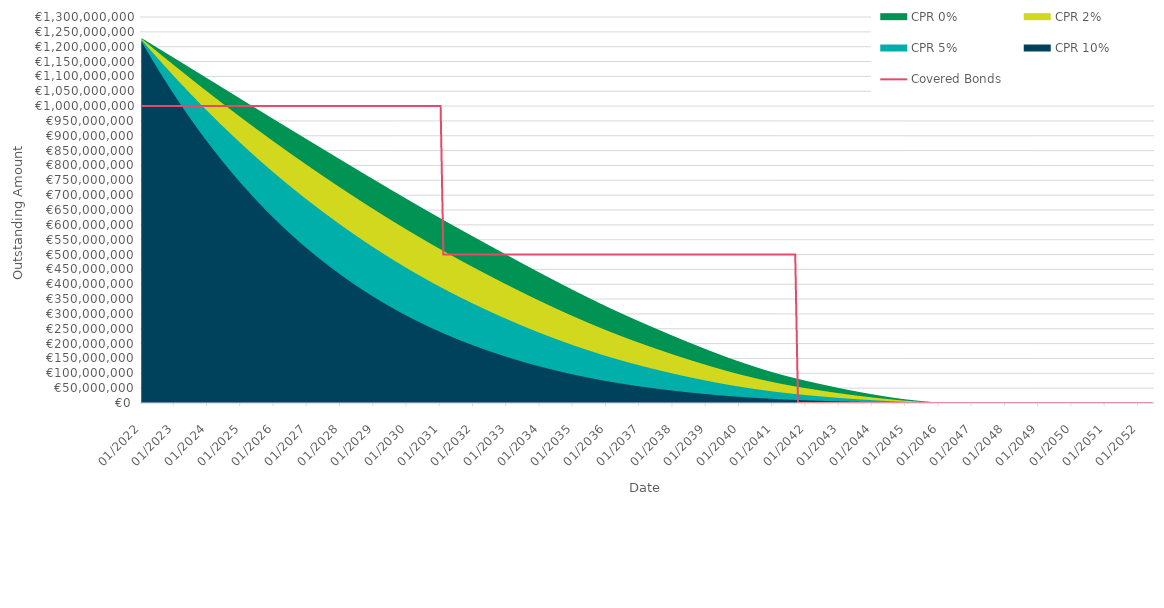
| Category | Covered Bonds |
|---|---|
| 2022-01-31 | 1000000000 |
| 2022-02-28 | 1000000000 |
| 2022-03-31 | 1000000000 |
| 2022-04-30 | 1000000000 |
| 2022-05-31 | 1000000000 |
| 2022-06-30 | 1000000000 |
| 2022-07-31 | 1000000000 |
| 2022-08-31 | 1000000000 |
| 2022-09-30 | 1000000000 |
| 2022-10-31 | 1000000000 |
| 2022-11-30 | 1000000000 |
| 2022-12-31 | 1000000000 |
| 2023-01-31 | 1000000000 |
| 2023-02-28 | 1000000000 |
| 2023-03-31 | 1000000000 |
| 2023-04-30 | 1000000000 |
| 2023-05-31 | 1000000000 |
| 2023-06-30 | 1000000000 |
| 2023-07-31 | 1000000000 |
| 2023-08-31 | 1000000000 |
| 2023-09-30 | 1000000000 |
| 2023-10-31 | 1000000000 |
| 2023-11-30 | 1000000000 |
| 2023-12-31 | 1000000000 |
| 2024-01-31 | 1000000000 |
| 2024-02-29 | 1000000000 |
| 2024-03-31 | 1000000000 |
| 2024-04-30 | 1000000000 |
| 2024-05-31 | 1000000000 |
| 2024-06-30 | 1000000000 |
| 2024-07-31 | 1000000000 |
| 2024-08-31 | 1000000000 |
| 2024-09-30 | 1000000000 |
| 2024-10-31 | 1000000000 |
| 2024-11-30 | 1000000000 |
| 2024-12-31 | 1000000000 |
| 2025-01-31 | 1000000000 |
| 2025-02-28 | 1000000000 |
| 2025-03-31 | 1000000000 |
| 2025-04-30 | 1000000000 |
| 2025-05-31 | 1000000000 |
| 2025-06-30 | 1000000000 |
| 2025-07-31 | 1000000000 |
| 2025-08-31 | 1000000000 |
| 2025-09-30 | 1000000000 |
| 2025-10-31 | 1000000000 |
| 2025-11-30 | 1000000000 |
| 2025-12-31 | 1000000000 |
| 2026-01-31 | 1000000000 |
| 2026-02-28 | 1000000000 |
| 2026-03-31 | 1000000000 |
| 2026-04-30 | 1000000000 |
| 2026-05-31 | 1000000000 |
| 2026-06-30 | 1000000000 |
| 2026-07-31 | 1000000000 |
| 2026-08-31 | 1000000000 |
| 2026-09-30 | 1000000000 |
| 2026-10-31 | 1000000000 |
| 2026-11-30 | 1000000000 |
| 2026-12-31 | 1000000000 |
| 2027-01-31 | 1000000000 |
| 2027-02-28 | 1000000000 |
| 2027-03-31 | 1000000000 |
| 2027-04-30 | 1000000000 |
| 2027-05-31 | 1000000000 |
| 2027-06-30 | 1000000000 |
| 2027-07-31 | 1000000000 |
| 2027-08-31 | 1000000000 |
| 2027-09-30 | 1000000000 |
| 2027-10-31 | 1000000000 |
| 2027-11-30 | 1000000000 |
| 2027-12-31 | 1000000000 |
| 2028-01-31 | 1000000000 |
| 2028-02-29 | 1000000000 |
| 2028-03-31 | 1000000000 |
| 2028-04-30 | 1000000000 |
| 2028-05-31 | 1000000000 |
| 2028-06-30 | 1000000000 |
| 2028-07-31 | 1000000000 |
| 2028-08-31 | 1000000000 |
| 2028-09-30 | 1000000000 |
| 2028-10-31 | 1000000000 |
| 2028-11-30 | 1000000000 |
| 2028-12-31 | 1000000000 |
| 2029-01-31 | 1000000000 |
| 2029-02-28 | 1000000000 |
| 2029-03-31 | 1000000000 |
| 2029-04-30 | 1000000000 |
| 2029-05-31 | 1000000000 |
| 2029-06-30 | 1000000000 |
| 2029-07-31 | 1000000000 |
| 2029-08-31 | 1000000000 |
| 2029-09-30 | 1000000000 |
| 2029-10-31 | 1000000000 |
| 2029-11-30 | 1000000000 |
| 2029-12-31 | 1000000000 |
| 2030-01-31 | 1000000000 |
| 2030-02-28 | 1000000000 |
| 2030-03-31 | 1000000000 |
| 2030-04-30 | 1000000000 |
| 2030-05-31 | 1000000000 |
| 2030-06-30 | 1000000000 |
| 2030-07-31 | 1000000000 |
| 2030-08-31 | 1000000000 |
| 2030-09-30 | 1000000000 |
| 2030-10-31 | 1000000000 |
| 2030-11-30 | 1000000000 |
| 2030-12-31 | 1000000000 |
| 2031-01-31 | 1000000000 |
| 2031-02-28 | 500000000 |
| 2031-03-31 | 500000000 |
| 2031-04-30 | 500000000 |
| 2031-05-31 | 500000000 |
| 2031-06-30 | 500000000 |
| 2031-07-31 | 500000000 |
| 2031-08-31 | 500000000 |
| 2031-09-30 | 500000000 |
| 2031-10-31 | 500000000 |
| 2031-11-30 | 500000000 |
| 2031-12-31 | 500000000 |
| 2032-01-31 | 500000000 |
| 2032-02-29 | 500000000 |
| 2032-03-31 | 500000000 |
| 2032-04-30 | 500000000 |
| 2032-05-31 | 500000000 |
| 2032-06-30 | 500000000 |
| 2032-07-31 | 500000000 |
| 2032-08-31 | 500000000 |
| 2032-09-30 | 500000000 |
| 2032-10-31 | 500000000 |
| 2032-11-30 | 500000000 |
| 2032-12-31 | 500000000 |
| 2033-01-31 | 500000000 |
| 2033-02-28 | 500000000 |
| 2033-03-31 | 500000000 |
| 2033-04-30 | 500000000 |
| 2033-05-31 | 500000000 |
| 2033-06-30 | 500000000 |
| 2033-07-31 | 500000000 |
| 2033-08-31 | 500000000 |
| 2033-09-30 | 500000000 |
| 2033-10-31 | 500000000 |
| 2033-11-30 | 500000000 |
| 2033-12-31 | 500000000 |
| 2034-01-31 | 500000000 |
| 2034-02-28 | 500000000 |
| 2034-03-31 | 500000000 |
| 2034-04-30 | 500000000 |
| 2034-05-31 | 500000000 |
| 2034-06-30 | 500000000 |
| 2034-07-31 | 500000000 |
| 2034-08-31 | 500000000 |
| 2034-09-30 | 500000000 |
| 2034-10-31 | 500000000 |
| 2034-11-30 | 500000000 |
| 2034-12-31 | 500000000 |
| 2035-01-31 | 500000000 |
| 2035-02-28 | 500000000 |
| 2035-03-31 | 500000000 |
| 2035-04-30 | 500000000 |
| 2035-05-31 | 500000000 |
| 2035-06-30 | 500000000 |
| 2035-07-31 | 500000000 |
| 2035-08-31 | 500000000 |
| 2035-09-30 | 500000000 |
| 2035-10-31 | 500000000 |
| 2035-11-30 | 500000000 |
| 2035-12-31 | 500000000 |
| 2036-01-31 | 500000000 |
| 2036-02-29 | 500000000 |
| 2036-03-31 | 500000000 |
| 2036-04-30 | 500000000 |
| 2036-05-31 | 500000000 |
| 2036-06-30 | 500000000 |
| 2036-07-31 | 500000000 |
| 2036-08-31 | 500000000 |
| 2036-09-30 | 500000000 |
| 2036-10-31 | 500000000 |
| 2036-11-30 | 500000000 |
| 2036-12-31 | 500000000 |
| 2037-01-31 | 500000000 |
| 2037-02-28 | 500000000 |
| 2037-03-31 | 500000000 |
| 2037-04-30 | 500000000 |
| 2037-05-31 | 500000000 |
| 2037-06-30 | 500000000 |
| 2037-07-31 | 500000000 |
| 2037-08-31 | 500000000 |
| 2037-09-30 | 500000000 |
| 2037-10-31 | 500000000 |
| 2037-11-30 | 500000000 |
| 2037-12-31 | 500000000 |
| 2038-01-31 | 500000000 |
| 2038-02-28 | 500000000 |
| 2038-03-31 | 500000000 |
| 2038-04-30 | 500000000 |
| 2038-05-31 | 500000000 |
| 2038-06-30 | 500000000 |
| 2038-07-31 | 500000000 |
| 2038-08-31 | 500000000 |
| 2038-09-30 | 500000000 |
| 2038-10-31 | 500000000 |
| 2038-11-30 | 500000000 |
| 2038-12-31 | 500000000 |
| 2039-01-31 | 500000000 |
| 2039-02-28 | 500000000 |
| 2039-03-31 | 500000000 |
| 2039-04-30 | 500000000 |
| 2039-05-31 | 500000000 |
| 2039-06-30 | 500000000 |
| 2039-07-31 | 500000000 |
| 2039-08-31 | 500000000 |
| 2039-09-30 | 500000000 |
| 2039-10-31 | 500000000 |
| 2039-11-30 | 500000000 |
| 2039-12-31 | 500000000 |
| 2040-01-31 | 500000000 |
| 2040-02-29 | 500000000 |
| 2040-03-31 | 500000000 |
| 2040-04-30 | 500000000 |
| 2040-05-31 | 500000000 |
| 2040-06-30 | 500000000 |
| 2040-07-31 | 500000000 |
| 2040-08-31 | 500000000 |
| 2040-09-30 | 500000000 |
| 2040-10-31 | 500000000 |
| 2040-11-30 | 500000000 |
| 2040-12-31 | 500000000 |
| 2041-01-31 | 500000000 |
| 2041-02-28 | 500000000 |
| 2041-03-31 | 500000000 |
| 2041-04-30 | 500000000 |
| 2041-05-31 | 500000000 |
| 2041-06-30 | 500000000 |
| 2041-07-31 | 500000000 |
| 2041-08-31 | 500000000 |
| 2041-09-30 | 500000000 |
| 2041-10-31 | 0 |
| 2041-11-30 | 0 |
| 2041-12-31 | 0 |
| 2042-01-31 | 0 |
| 2042-02-28 | 0 |
| 2042-03-31 | 0 |
| 2042-04-30 | 0 |
| 2042-05-31 | 0 |
| 2042-06-30 | 0 |
| 2042-07-31 | 0 |
| 2042-08-31 | 0 |
| 2042-09-30 | 0 |
| 2042-10-31 | 0 |
| 2042-11-30 | 0 |
| 2042-12-31 | 0 |
| 2043-01-31 | 0 |
| 2043-02-28 | 0 |
| 2043-03-31 | 0 |
| 2043-04-30 | 0 |
| 2043-05-31 | 0 |
| 2043-06-30 | 0 |
| 2043-07-31 | 0 |
| 2043-08-31 | 0 |
| 2043-09-30 | 0 |
| 2043-10-31 | 0 |
| 2043-11-30 | 0 |
| 2043-12-31 | 0 |
| 2044-01-31 | 0 |
| 2044-02-29 | 0 |
| 2044-03-31 | 0 |
| 2044-04-30 | 0 |
| 2044-05-31 | 0 |
| 2044-06-30 | 0 |
| 2044-07-31 | 0 |
| 2044-08-31 | 0 |
| 2044-09-30 | 0 |
| 2044-10-31 | 0 |
| 2044-11-30 | 0 |
| 2044-12-31 | 0 |
| 2045-01-31 | 0 |
| 2045-02-28 | 0 |
| 2045-03-31 | 0 |
| 2045-04-30 | 0 |
| 2045-05-31 | 0 |
| 2045-06-30 | 0 |
| 2045-07-31 | 0 |
| 2045-08-31 | 0 |
| 2045-09-30 | 0 |
| 2045-10-31 | 0 |
| 2045-11-30 | 0 |
| 2045-12-31 | 0 |
| 2046-01-31 | 0 |
| 2046-02-28 | 0 |
| 2046-03-31 | 0 |
| 2046-04-30 | 0 |
| 2046-05-31 | 0 |
| 2046-06-30 | 0 |
| 2046-07-31 | 0 |
| 2046-08-31 | 0 |
| 2046-09-30 | 0 |
| 2046-10-31 | 0 |
| 2046-11-30 | 0 |
| 2046-12-31 | 0 |
| 2047-01-31 | 0 |
| 2047-02-28 | 0 |
| 2047-03-31 | 0 |
| 2047-04-30 | 0 |
| 2047-05-31 | 0 |
| 2047-06-30 | 0 |
| 2047-07-31 | 0 |
| 2047-08-31 | 0 |
| 2047-09-30 | 0 |
| 2047-10-31 | 0 |
| 2047-11-30 | 0 |
| 2047-12-31 | 0 |
| 2048-01-31 | 0 |
| 2048-02-29 | 0 |
| 2048-03-31 | 0 |
| 2048-04-30 | 0 |
| 2048-05-31 | 0 |
| 2048-06-30 | 0 |
| 2048-07-31 | 0 |
| 2048-08-31 | 0 |
| 2048-09-30 | 0 |
| 2048-10-31 | 0 |
| 2048-11-30 | 0 |
| 2048-12-31 | 0 |
| 2049-01-31 | 0 |
| 2049-02-28 | 0 |
| 2049-03-31 | 0 |
| 2049-04-30 | 0 |
| 2049-05-31 | 0 |
| 2049-06-30 | 0 |
| 2049-07-31 | 0 |
| 2049-08-31 | 0 |
| 2049-09-30 | 0 |
| 2049-10-31 | 0 |
| 2049-11-30 | 0 |
| 2049-12-31 | 0 |
| 2050-01-31 | 0 |
| 2050-02-28 | 0 |
| 2050-03-31 | 0 |
| 2050-04-30 | 0 |
| 2050-05-31 | 0 |
| 2050-06-30 | 0 |
| 2050-07-31 | 0 |
| 2050-08-31 | 0 |
| 2050-09-30 | 0 |
| 2050-10-31 | 0 |
| 2050-11-30 | 0 |
| 2050-12-31 | 0 |
| 2051-01-31 | 0 |
| 2051-02-28 | 0 |
| 2051-03-31 | 0 |
| 2051-04-30 | 0 |
| 2051-05-31 | 0 |
| 2051-06-30 | 0 |
| 2051-07-31 | 0 |
| 2051-08-31 | 0 |
| 2051-09-30 | 0 |
| 2051-10-31 | 0 |
| 2051-11-30 | 0 |
| 2051-12-31 | 0 |
| 2052-01-31 | 0 |
| 2052-02-29 | 0 |
| 2052-03-31 | 0 |
| 2052-04-30 | 0 |
| 2052-05-31 | 0 |
| 2052-06-30 | 0 |